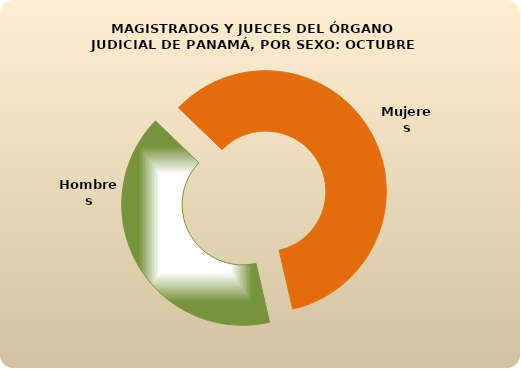
| Category | Series 0 |
|---|---|
| Hombres | 206 |
| Mujeres | 299 |